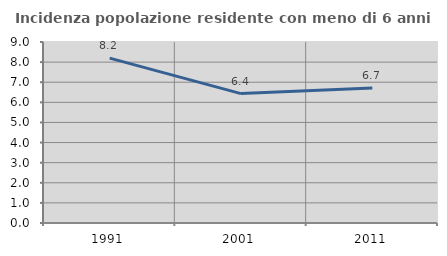
| Category | Incidenza popolazione residente con meno di 6 anni |
|---|---|
| 1991.0 | 8.197 |
| 2001.0 | 6.433 |
| 2011.0 | 6.71 |